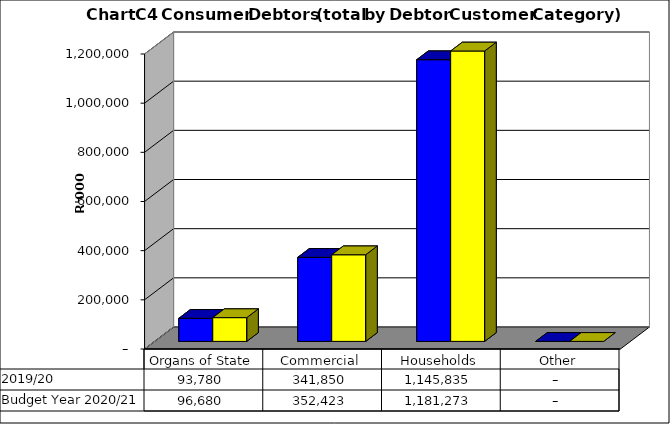
| Category |  2019/20  | Budget Year 2020/21 |
|---|---|---|
| Organs of State | 93779820.19 | 96680227 |
| Commercial | 341849960.8 | 352422640 |
| Households | 1145834912.82 | 1181273106 |
| Other | 0 | 0 |